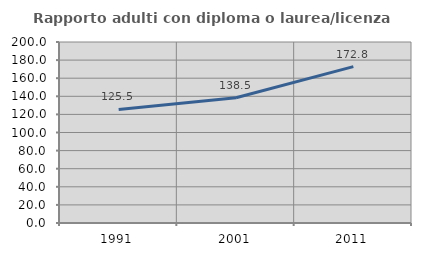
| Category | Rapporto adulti con diploma o laurea/licenza media  |
|---|---|
| 1991.0 | 125.475 |
| 2001.0 | 138.479 |
| 2011.0 | 172.773 |